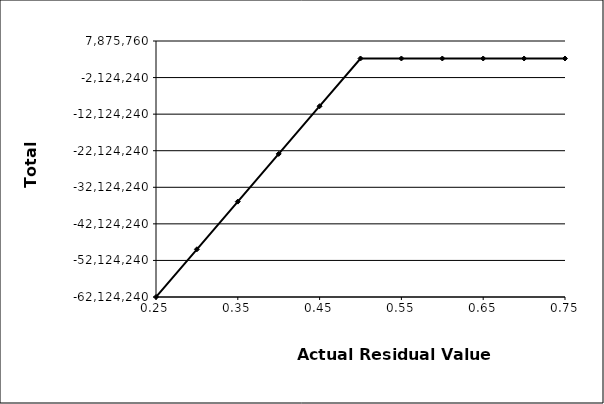
| Category | Total NPV |
|---|---|
| 0.25 | -62124239.91 |
| 0.3 | -49081224.15 |
| 0.35 | -36038208.391 |
| 0.4 | -22995192.632 |
| 0.45 | -9952176.873 |
| 0.5 | 3090838.887 |
| 0.55 | 3090838.887 |
| 0.6 | 3090838.887 |
| 0.65 | 3090838.887 |
| 0.7 | 3090838.887 |
| 0.75 | 3090838.887 |